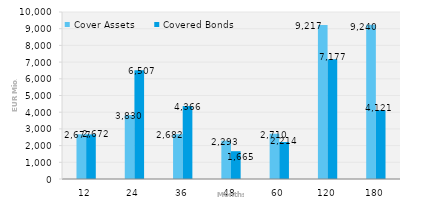
| Category | Cover Assets | Covered Bonds |
|---|---|---|
| 12.0 | 2676.6 | 2671.9 |
| 24.0 | 3829.6 | 6507.4 |
| 36.0 | 2682 | 4365.9 |
| 48.0 | 2292.7 | 1664.5 |
| 60.0 | 2710 | 2213.7 |
| 120.0 | 9217.1 | 7177.1 |
| 180.0 | 9239.7 | 4121.4 |